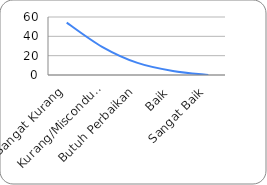
| Category | Pola Distribusi |
|---|---|
| Sangat Kurang | 54.167 |
| Kurang/Misconduct | 29.167 |
| Butuh Perbaikan | 12.5 |
| Baik | 4.167 |
| Sangat Baik | 0 |